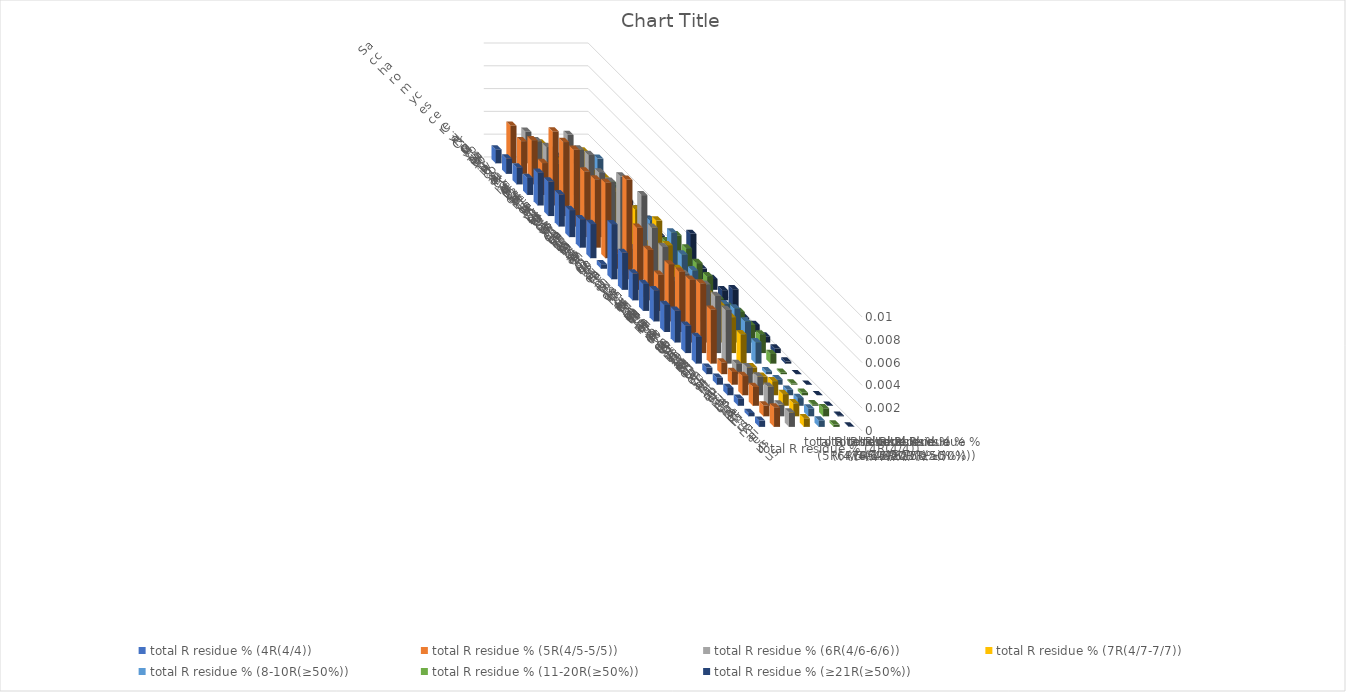
| Category | total R residue % (4R(4/4)) | total R residue % (5R(4/5-5/5)) | total R residue % (6R(4/6-6/6)) | total R residue % (7R(4/7-7/7)) | total R residue % (8-10R(≥50%)) | total R residue % (11-20R(≥50%)) | total R residue % (≥21R(≥50%)) |
|---|---|---|---|---|---|---|---|
| Saccharomyces cerevisiae S288c | 0.001 | 0.003 | 0.003 | 0.002 | 0.001 | 0 | 0 |
| Candida albicans | 0.001 | 0.003 | 0.003 | 0.002 | 0.001 | 0 | 0 |
| Candida auris | 0.001 | 0.004 | 0.003 | 0.002 | 0.001 | 0 | 0 |
| Candida tropicalis | 0.001 | 0.003 | 0.003 | 0.002 | 0.001 | 0 | 0 |
| Neurospora crassa | 0.003 | 0.007 | 0.006 | 0.005 | 0.004 | 0.002 | 0 |
| Magnaporthe oryzae | 0.003 | 0.006 | 0.006 | 0.004 | 0.002 | 0.001 | 0.001 |
| Trichoderma reesei | 0.003 | 0.007 | 0.006 | 0.004 | 0.003 | 0.001 | 0.001 |
| Cryptococcus neoformans | 0.002 | 0.006 | 0.006 | 0.004 | 0.002 | 0.001 | 0 |
| Ustilago maydis | 0.003 | 0.006 | 0.006 | 0.003 | 0.002 | 0.001 | 0 |
| Taiwanofungus camphoratus | 0.003 | 0.007 | 0.007 | 0.004 | 0.003 | 0.001 | 0 |
| Dictyostelium discoideum | 0 | 0.001 | 0.002 | 0.002 | 0.002 | 0.003 | 0.003 |
| Chlamydomonas reinhardtii | 0.005 | 0.009 | 0.007 | 0.005 | 0.004 | 0.003 | 0.001 |
| Drosophila melanogaster | 0.003 | 0.005 | 0.005 | 0.004 | 0.003 | 0.002 | 0.001 |
| Aedes aegypti | 0.002 | 0.004 | 0.005 | 0.003 | 0.003 | 0.002 | 0.001 |
| Plasmodium falciparum | 0.002 | 0.003 | 0.003 | 0.002 | 0.002 | 0.001 | 0.002 |
| Caenorhabditis elegans | 0.003 | 0.005 | 0.004 | 0.002 | 0.002 | 0.001 | 0 |
| Danio rerio | 0.002 | 0.005 | 0.004 | 0.003 | 0.002 | 0.002 | 0.001 |
| Mus musculus | 0.003 | 0.006 | 0.005 | 0.003 | 0.003 | 0.002 | 0.001 |
| Homo sapiens | 0.002 | 0.006 | 0.005 | 0.003 | 0.003 | 0.002 | 0 |
| Arabidopsis thaliana | 0.002 | 0.005 | 0.005 | 0.003 | 0.002 | 0.001 | 0 |
| Tetrahymena thermophila | 0.001 | 0.001 | 0.001 | 0.001 | 0 | 0 | 0 |
| Paramecium tetraurelia | 0.001 | 0.001 | 0.002 | 0.001 | 0 | 0 | 0 |
| Oxytricha trifallax | 0.001 | 0.002 | 0.002 | 0.001 | 0 | 0 | 0 |
| Stylonychia lemnae | 0.001 | 0.002 | 0.002 | 0.001 | 0.001 | 0 | 0 |
| Pseudocohnilembus persalinus | 0 | 0.001 | 0.001 | 0.001 | 0.001 | 0.001 | 0 |
| Stentor coeruleus | 0.001 | 0.002 | 0.001 | 0.001 | 0.001 | 0 | 0 |